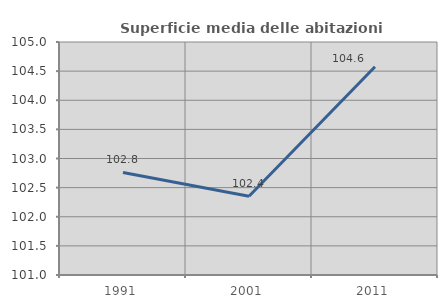
| Category | Superficie media delle abitazioni occupate |
|---|---|
| 1991.0 | 102.76 |
| 2001.0 | 102.353 |
| 2011.0 | 104.574 |